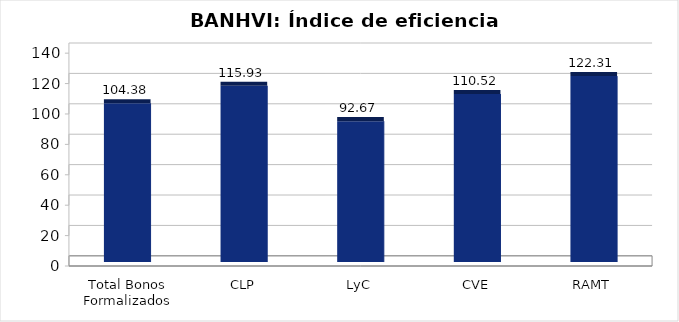
| Category | Índice de eficiencia (IE)  |
|---|---|
| Total Bonos Formalizados | 104.379 |
| CLP | 115.93 |
| LyC | 92.67 |
| CVE | 110.518 |
| RAMT | 122.306 |